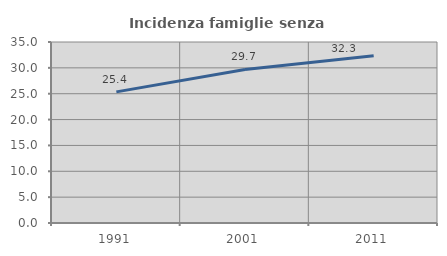
| Category | Incidenza famiglie senza nuclei |
|---|---|
| 1991.0 | 25.356 |
| 2001.0 | 29.701 |
| 2011.0 | 32.326 |